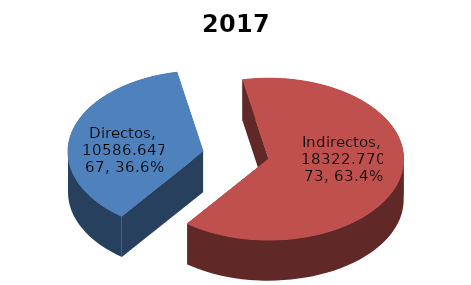
| Category | Series 0 |
|---|---|
| Directos | 10586.648 |
| Indirectos | 18322.771 |